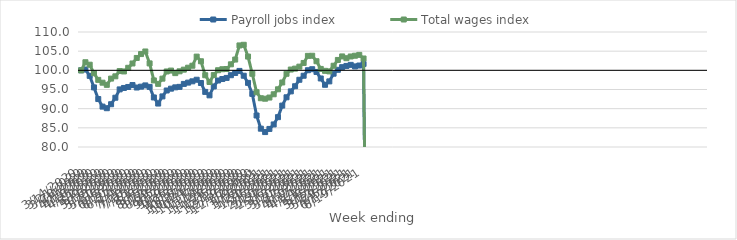
| Category | Payroll jobs index | Total wages index |
|---|---|---|
| 14/03/2020 | 100 | 100 |
| 21/03/2020 | 100.213 | 102.111 |
| 28/03/2020 | 98.559 | 101.469 |
| 04/04/2020 | 95.546 | 99.243 |
| 11/04/2020 | 92.511 | 97.511 |
| 18/04/2020 | 90.535 | 96.777 |
| 25/04/2020 | 90.117 | 96.212 |
| 02/05/2020 | 91.157 | 97.845 |
| 09/05/2020 | 92.856 | 98.439 |
| 16/05/2020 | 95.024 | 99.807 |
| 23/05/2020 | 95.402 | 99.71 |
| 30/05/2020 | 95.659 | 100.663 |
| 06/06/2020 | 96.161 | 101.79 |
| 13/06/2020 | 95.515 | 103.226 |
| 20/06/2020 | 95.74 | 104.242 |
| 27/06/2020 | 96.068 | 104.92 |
| 04/07/2020 | 95.681 | 101.808 |
| 11/07/2020 | 92.923 | 97.367 |
| 18/07/2020 | 91.335 | 96.471 |
| 25/07/2020 | 93.198 | 97.83 |
| 01/08/2020 | 94.742 | 99.705 |
| 08/08/2020 | 95.219 | 99.94 |
| 15/08/2020 | 95.561 | 99.271 |
| 22/08/2020 | 95.687 | 99.746 |
| 29/08/2020 | 96.457 | 100.18 |
| 05/09/2020 | 96.797 | 100.688 |
| 12/09/2020 | 97.134 | 101.201 |
| 19/09/2020 | 97.544 | 103.577 |
| 26/09/2020 | 96.694 | 102.366 |
| 03/10/2020 | 94.373 | 98.722 |
| 10/10/2020 | 93.475 | 96.962 |
| 17/10/2020 | 95.791 | 98.756 |
| 24/10/2020 | 97.346 | 100.028 |
| 31/10/2020 | 97.733 | 100.29 |
| 07/11/2020 | 98.024 | 100.346 |
| 14/11/2020 | 98.727 | 101.568 |
| 21/11/2020 | 99.311 | 102.81 |
| 28/11/2020 | 99.85 | 106.495 |
| 05/12/2020 | 98.592 | 106.664 |
| 12/12/2020 | 96.73 | 103.592 |
| 19/12/2020 | 93.855 | 99.106 |
| 26/12/2020 | 88.218 | 94.294 |
| 02/01/2021 | 84.778 | 92.724 |
| 09/01/2021 | 83.895 | 92.598 |
| 16/01/2021 | 84.713 | 92.9 |
| 23/01/2021 | 85.884 | 93.755 |
| 30/01/2021 | 87.786 | 95.054 |
| 06/02/2021 | 90.802 | 96.834 |
| 13/02/2021 | 92.969 | 99.102 |
| 20/02/2021 | 94.509 | 100.207 |
| 27/02/2021 | 95.852 | 100.449 |
| 06/03/2021 | 97.537 | 100.963 |
| 13/03/2021 | 98.591 | 101.923 |
| 20/03/2021 | 100.029 | 103.776 |
| 27/03/2021 | 100.294 | 103.808 |
| 03/04/2021 | 99.581 | 102.376 |
| 10/04/2021 | 97.874 | 100.369 |
| 17/04/2021 | 96.231 | 99.869 |
| 24/04/2021 | 97.119 | 99.728 |
| 01/05/2021 | 99.126 | 101.196 |
| 08/05/2021 | 100.132 | 102.709 |
| 15/05/2021 | 100.827 | 103.626 |
| 22/05/2021 | 101.144 | 103.166 |
| 29/05/2021 | 101.426 | 103.613 |
| 05/06/2021 | 101.027 | 103.809 |
| 12/06/2021 | 101.256 | 104.03 |
| 19/06/2021 | 101.66 | 103.09 |